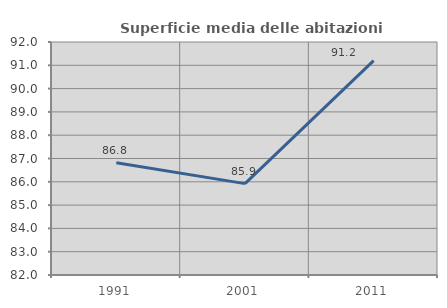
| Category | Superficie media delle abitazioni occupate |
|---|---|
| 1991.0 | 86.815 |
| 2001.0 | 85.922 |
| 2011.0 | 91.197 |